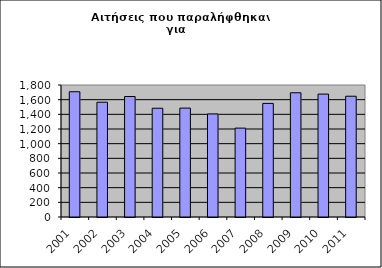
| Category | Series 0 |
|---|---|
| 2001.0 | 1708 |
| 2002.0 | 1565 |
| 2003.0 | 1643 |
| 2004.0 | 1483 |
| 2005.0 | 1485 |
| 2006.0 | 1405 |
| 2007.0 | 1212 |
| 2008.0 | 1549 |
| 2009.0 | 1694 |
| 2010.0 | 1676 |
| 2011.0 | 1647 |